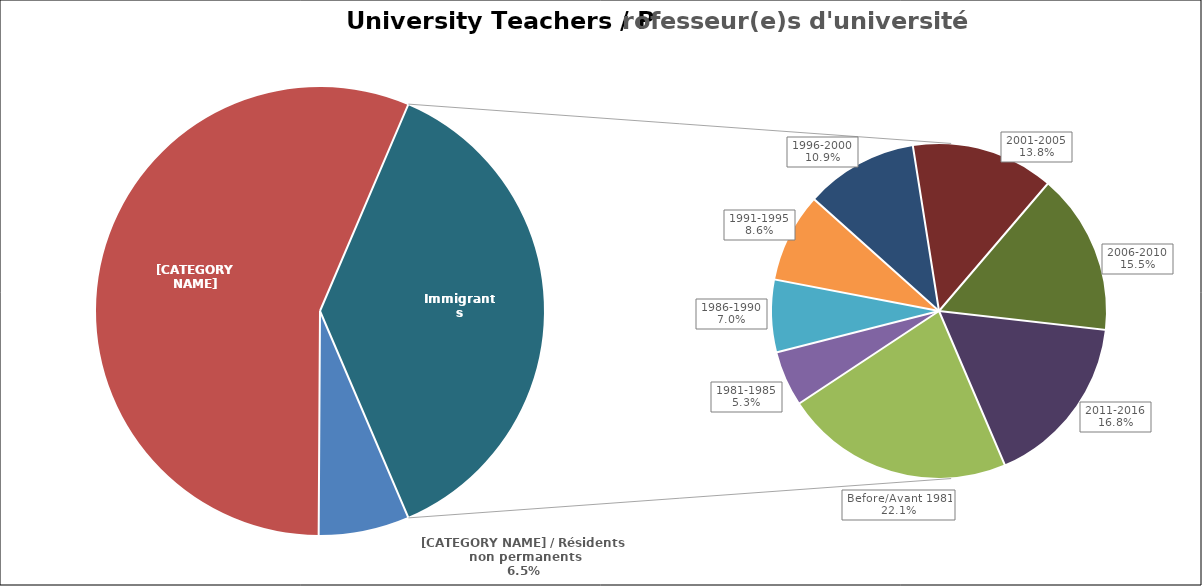
| Category | Series 0 |
|---|---|
|   Non-permanent residents | 4995 |
|   Non-immigrants | 43130 |
|     Before 1981 | 6290 |
|     1981 to 1985 | 1520 |
|     1986 to 1990 | 1985 |
|     1991 to 1995 | 2445 |
|     1996 to 2000 | 3095 |
|     2001 to 2005 | 3910 |
|     2006 to 2010 | 4420 |
|     2011 to 2016 | 4770 |